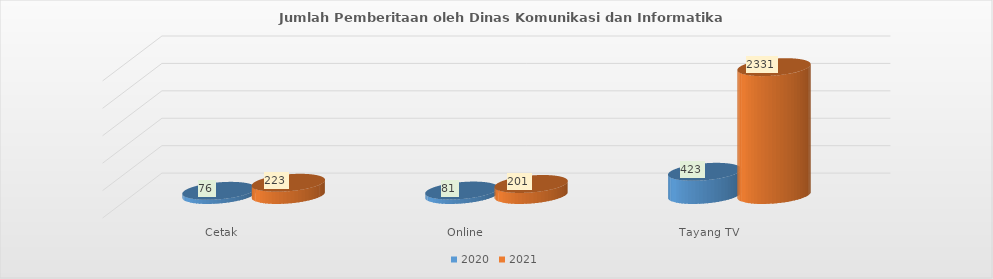
| Category | 2020 | 2021 |
|---|---|---|
| Cetak  | 76 | 223 |
| Online | 81 | 201 |
| Tayang TV | 423 | 2331 |